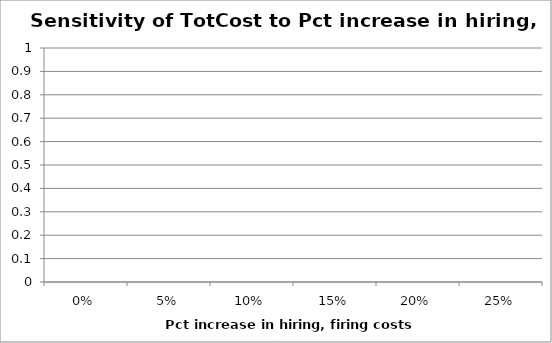
| Category | Series 0 |
|---|---|
| 0.0 | 0 |
| 0.05000000074505806 | 0 |
| 0.10000000149011612 | 0 |
| 0.15000000596046448 | 0 |
| 0.20000000298023224 | 0 |
| 0.25 | 0 |